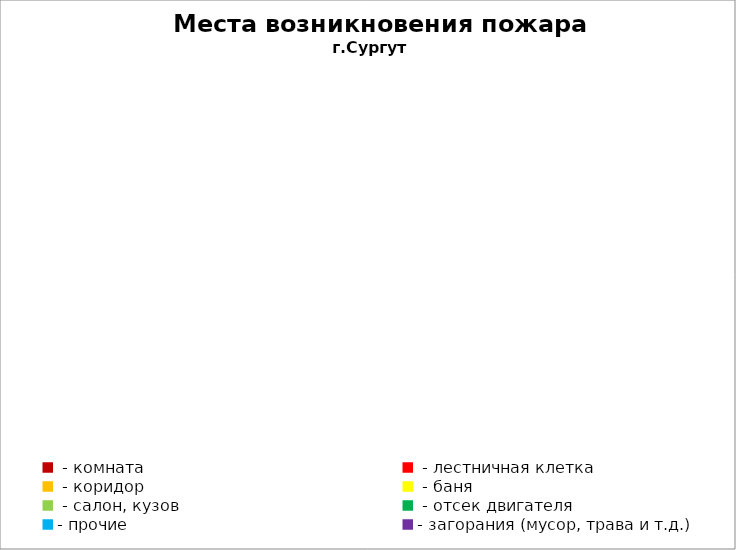
| Category | Места возникновения пожара |
|---|---|
|  - комната | 41 |
|  - лестничная клетка | 9 |
|  - коридор | 7 |
|  - баня | 17 |
|  - салон, кузов | 22 |
|  - отсек двигателя | 33 |
| - прочие | 126 |
| - загорания (мусор, трава и т.д.)  | 99 |